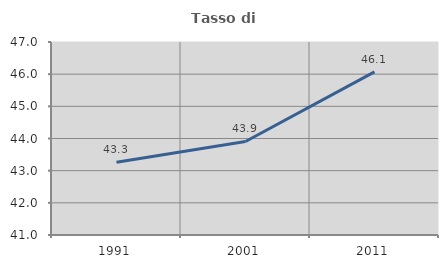
| Category | Tasso di occupazione   |
|---|---|
| 1991.0 | 43.261 |
| 2001.0 | 43.907 |
| 2011.0 | 46.069 |